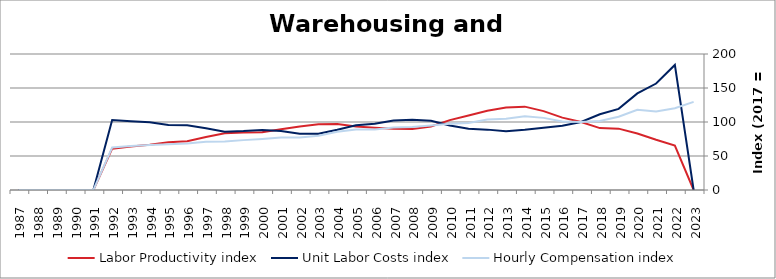
| Category | Labor Productivity index | Unit Labor Costs index | Hourly Compensation index |
|---|---|---|---|
| 2023.0 | 0 | 0 | 129.57 |
| 2022.0 | 65.382 | 183.901 | 120.238 |
| 2021.0 | 73.817 | 156.595 | 115.594 |
| 2020.0 | 83.097 | 142.105 | 118.086 |
| 2019.0 | 90.228 | 119.302 | 107.643 |
| 2018.0 | 91.007 | 111.383 | 101.366 |
| 2017.0 | 100 | 100 | 100 |
| 2016.0 | 106.439 | 94.495 | 100.58 |
| 2015.0 | 115.981 | 91.456 | 106.072 |
| 2014.0 | 122.585 | 88.565 | 108.567 |
| 2013.0 | 121.221 | 86.471 | 104.821 |
| 2012.0 | 116.641 | 88.784 | 103.559 |
| 2011.0 | 109.609 | 90.008 | 98.657 |
| 2010.0 | 102.728 | 94.755 | 97.34 |
| 2009.0 | 93.303 | 101.808 | 94.99 |
| 2008.0 | 89.728 | 103.228 | 92.624 |
| 2007.0 | 89.896 | 102.28 | 91.945 |
| 2006.0 | 91.529 | 97.282 | 89.041 |
| 2005.0 | 93.329 | 95.302 | 88.945 |
| 2004.0 | 96.913 | 88.536 | 85.803 |
| 2003.0 | 96.543 | 82.757 | 79.896 |
| 2002.0 | 93.368 | 82.763 | 77.274 |
| 2001.0 | 89.313 | 86.639 | 77.38 |
| 2000.0 | 84.947 | 88.414 | 75.105 |
| 1999.0 | 84.603 | 86.693 | 73.345 |
| 1998.0 | 83.332 | 85.673 | 71.393 |
| 1997.0 | 78.083 | 90.825 | 70.919 |
| 1996.0 | 71.816 | 95.18 | 68.355 |
| 1995.0 | 70.237 | 95.713 | 67.226 |
| 1994.0 | 66.418 | 99.704 | 66.221 |
| 1993.0 | 64.088 | 101.046 | 64.759 |
| 1992.0 | 60.772 | 102.833 | 62.493 |
| 1991.0 | 0 | 0 | 0 |
| 1990.0 | 0 | 0 | 0 |
| 1989.0 | 0 | 0 | 0 |
| 1988.0 | 0 | 0 | 0 |
| 1987.0 | 0 | 0 | 0 |